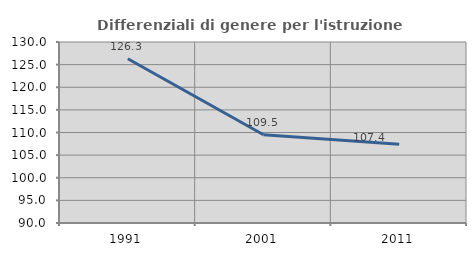
| Category | Differenziali di genere per l'istruzione superiore |
|---|---|
| 1991.0 | 126.3 |
| 2001.0 | 109.49 |
| 2011.0 | 107.42 |